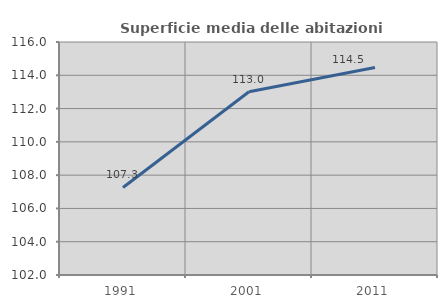
| Category | Superficie media delle abitazioni occupate |
|---|---|
| 1991.0 | 107.26 |
| 2001.0 | 113.013 |
| 2011.0 | 114.469 |